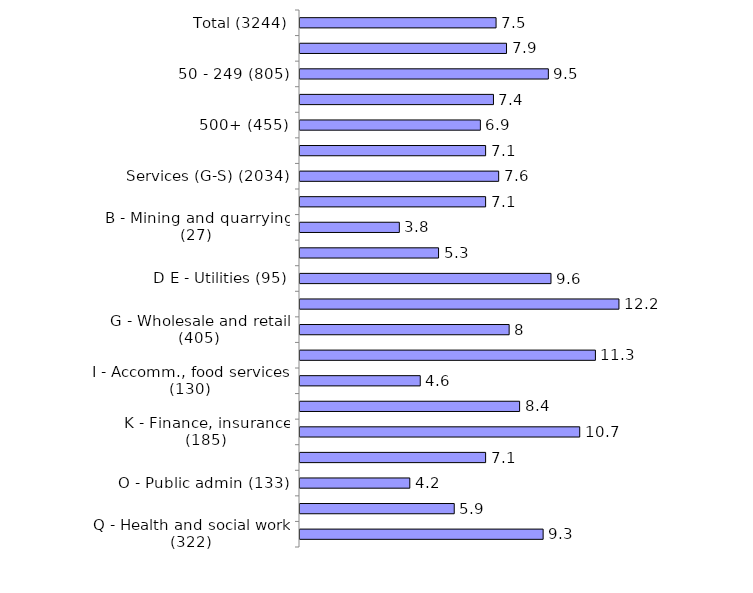
| Category | Series 0 |
|---|---|
| Total (3244) | 7.5 |
| 10-49 (1658) | 7.9 |
| 50 - 249 (805) | 9.5 |
| 250 - 499 (326) | 7.4 |
| 500+ (455) | 6.9 |
| Production (A-F) (1210) | 7.1 |
| Services (G-S) (2034) | 7.6 |
| A - Agriculture (96) | 7.1 |
| B - Mining and quarrying (27) | 3.8 |
| C - Manufacturing (866) | 5.3 |
| D E - Utilities (95) | 9.6 |
| F - Construction (126) | 12.2 |
| G - Wholesale and retail (405) | 8 |
| H - Transport, storage (148) | 11.3 |
| I - Accomm., food services (130) | 4.6 |
| J - Information, comms (110) | 8.4 |
| K - Finance, insurance (185) | 10.7 |
| L M N R S - Business, technical, admin, arts, other services (272) | 7.1 |
| O - Public admin (133) | 4.2 |
| P - Education (329) | 5.9 |
| Q - Health and social work (322) | 9.3 |